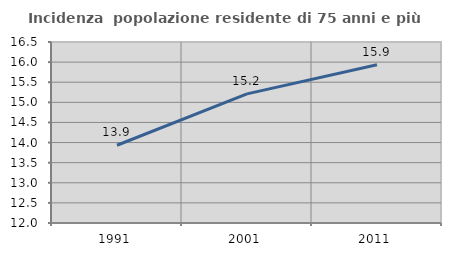
| Category | Incidenza  popolazione residente di 75 anni e più |
|---|---|
| 1991.0 | 13.933 |
| 2001.0 | 15.211 |
| 2011.0 | 15.932 |